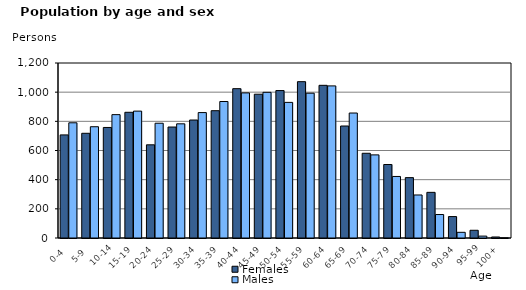
| Category | Females | Males |
|---|---|---|
|   0-4  | 707 | 790 |
|   5-9  | 718 | 763 |
| 10-14 | 758 | 846 |
| 15-19  | 862 | 870 |
| 20-24  | 639 | 787 |
| 25-29  | 761 | 783 |
| 30-34  | 809 | 860 |
| 35-39  | 873 | 936 |
| 40-44  | 1024 | 995 |
| 45-49  | 986 | 999 |
| 50-54  | 1011 | 930 |
| 55-59  | 1072 | 993 |
| 60-64  | 1047 | 1043 |
| 65-69  | 768 | 857 |
| 70-74  | 581 | 570 |
| 75-79  | 504 | 422 |
| 80-84  | 414 | 295 |
| 85-89  | 313 | 161 |
| 90-94  | 147 | 39 |
| 95-99 | 53 | 13 |
| 100+ | 7 | 1 |